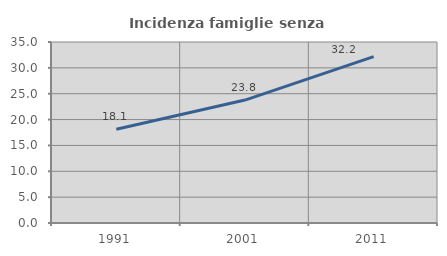
| Category | Incidenza famiglie senza nuclei |
|---|---|
| 1991.0 | 18.125 |
| 2001.0 | 23.775 |
| 2011.0 | 32.182 |